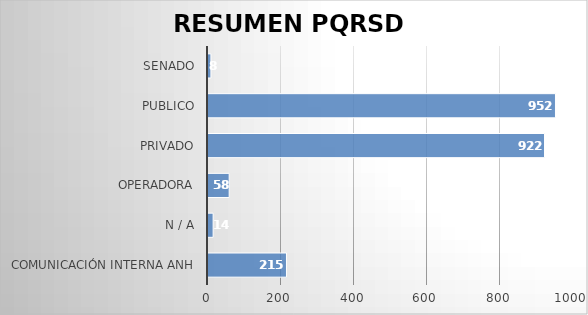
| Category | ENTIDAD PQRSD  2020 |
|---|---|
| COMUNICACIÓN INTERNA ANH | 215 |
| N / A | 14 |
| OPERADORA | 58 |
| PRIVADO | 922 |
| PUBLICO | 952 |
| SENADO | 8 |